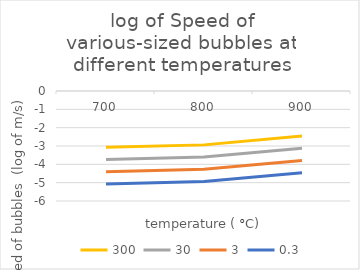
| Category | 300 | 30 | 3 | 0.3 |
|---|---|---|---|---|
| 700.0 | -3.074 | -3.74 | -4.407 | -5.074 |
| 800.0 | -2.939 | -3.605 | -4.272 | -4.939 |
| 900.0 | -2.453 | -3.12 | -3.786 | -4.453 |